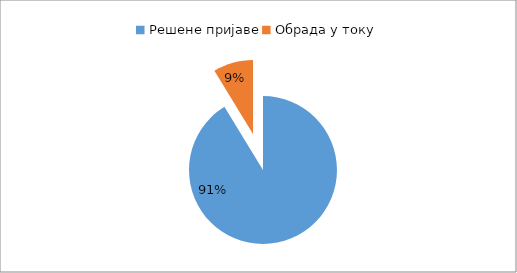
| Category | Series 0 |
|---|---|
| Решене пријаве | 0.919 |
| Обрада у току | 0.088 |